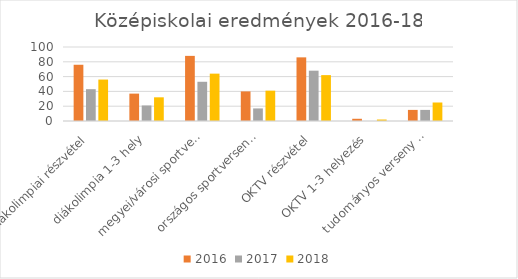
| Category | 2016 | 2017 | 2018 |
|---|---|---|---|
| diákolimpiai részvétel | 76 | 43 | 56 |
| diákolimpia 1-3 hely | 37 | 21 | 32 |
| megyei/városi sportverseny 1-3 hely | 88 | 53 | 64 |
| országos sportverseny 1-3 hely | 40 | 17 | 41 |
| OKTV részvétel | 86 | 68 | 62 |
| OKTV 1-3 helyezés | 3 | 0 | 2 |
| tudományos verseny 1-3 helyezés | 15 | 15 | 25 |